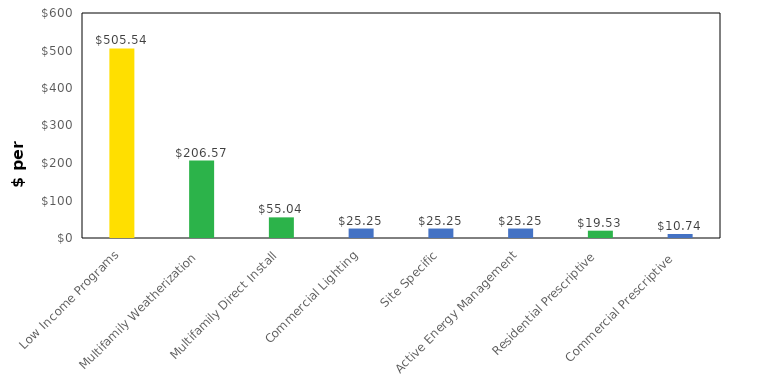
| Category | Series 0 |
|---|---|
| Low Income Programs | 505.545 |
| Multifamily Weatherization | 206.568 |
| Multifamily Direct Install | 55.044 |
| Commercial Lighting | 25.25 |
| Site Specific | 25.25 |
| Active Energy Management | 25.25 |
| Residential Prescriptive | 19.528 |
| Commercial Prescriptive  | 10.737 |